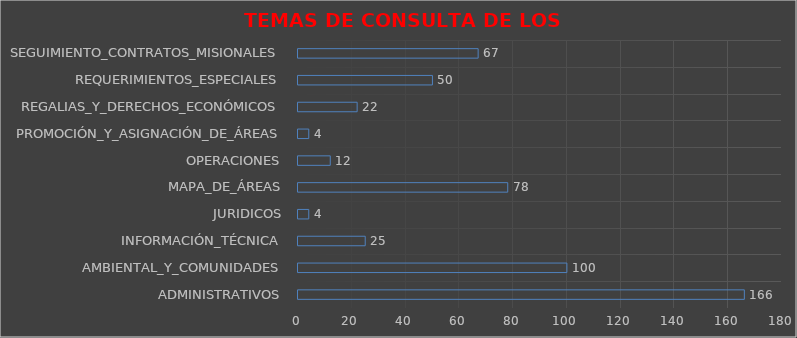
| Category | TEMAS DE CONSULTA 3º TRIMESTRE DE 2020 |
|---|---|
| ADMINISTRATIVOS | 166 |
| AMBIENTAL_Y_COMUNIDADES | 100 |
| INFORMACIÓN_TÉCNICA | 25 |
| JURIDICOS | 4 |
| MAPA_DE_ÁREAS | 78 |
| OPERACIONES | 12 |
| PROMOCIÓN_Y_ASIGNACIÓN_DE_ÁREAS | 4 |
| REGALIAS_Y_DERECHOS_ECONÓMICOS | 22 |
| REQUERIMIENTOS_ESPECIALES | 50 |
| SEGUIMIENTO_CONTRATOS_MISIONALES | 67 |